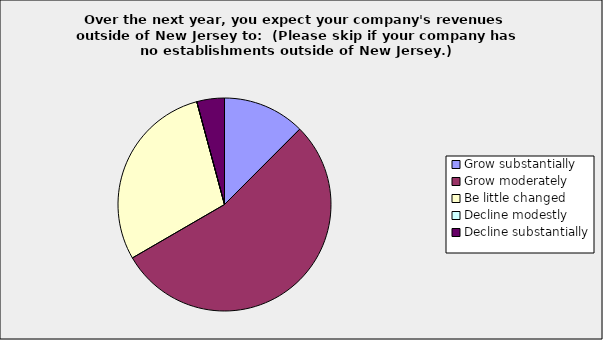
| Category | Series 0 |
|---|---|
| Grow substantially | 0.125 |
| Grow moderately | 0.542 |
| Be little changed | 0.292 |
| Decline modestly | 0 |
| Decline substantially | 0.042 |